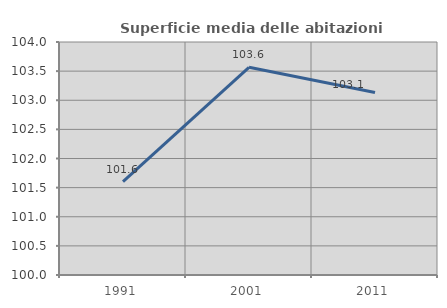
| Category | Superficie media delle abitazioni occupate |
|---|---|
| 1991.0 | 101.602 |
| 2001.0 | 103.565 |
| 2011.0 | 103.133 |